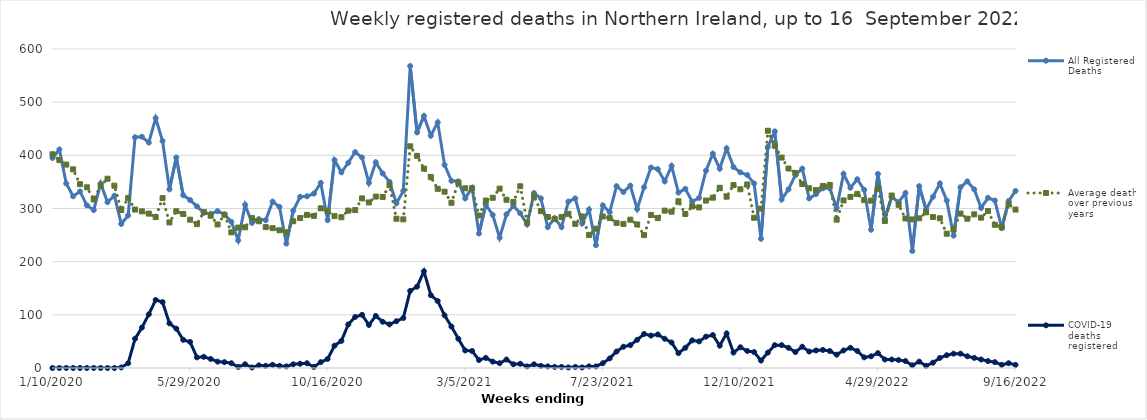
| Category | All Registered Deaths | Average deaths over previous 5 years | COVID-19 deaths registered |
|---|---|---|---|
| 1/10/20 | 395 | 402 | 0 |
| 1/17/20 | 411 | 391 | 0 |
| 1/24/20 | 347 | 382.6 | 0 |
| 1/31/20 | 323 | 373.6 | 0 |
| 2/7/20 | 332 | 345.8 | 0 |
| 2/14/20 | 306 | 339.8 | 0 |
| 2/21/20 | 297 | 317 | 0 |
| 2/28/20 | 347 | 343 | 0 |
| 3/6/20 | 312 | 356 | 0 |
| 3/13/20 | 324 | 342.8 | 0 |
| 3/20/20 | 271 | 297.2 | 1 |
| 3/27/20 | 287 | 319.6 | 9 |
| 4/3/20 | 434 | 298 | 55 |
| 4/10/20 | 435 | 294.6 | 76 |
| 4/17/20 | 424 | 290.4 | 101 |
| 4/24/20 | 470 | 283.8 | 128 |
| 5/1/20 | 427 | 319.6 | 124 |
| 5/8/20 | 336 | 273.8 | 84 |
| 5/15/20 | 396 | 294.8 | 74 |
| 5/22/20 | 325 | 289.8 | 53 |
| 5/29/20 | 316 | 279 | 49 |
| 6/5/20 | 304 | 270.6 | 20 |
| 6/12/20 | 292 | 293.2 | 21 |
| 6/19/20 | 290 | 286.4 | 17 |
| 6/26/20 | 295 | 270 | 12 |
| 7/3/20 | 289 | 288.2 | 11 |
| 7/10/20 | 275 | 255.2 | 9 |
| 7/17/20 | 240 | 264 | 2 |
| 7/24/20 | 307 | 264.6 | 7 |
| 7/31/20 | 273 | 282 | 1 |
| 8/7/20 | 280 | 276 | 5 |
| 8/14/20 | 278 | 265 | 4 |
| 8/21/20 | 313 | 263 | 6 |
| 8/28/20 | 303 | 259 | 4 |
| 9/4/20 | 234 | 255 | 3 |
| 9/11/20 | 296 | 276 | 7 |
| 9/18/20 | 322 | 282 | 8 |
| 9/25/20 | 323 | 288 | 9 |
| 10/2/20 | 328 | 286 | 2 |
| 10/9/20 | 348 | 300.4 | 11 |
| 10/16/20 | 278 | 294.8 | 17 |
| 10/23/20 | 391 | 285.6 | 42 |
| 10/30/20 | 368 | 283.6 | 51 |
| 11/6/20 | 386 | 296 | 82 |
| 11/13/20 | 406 | 297 | 96 |
| 11/20/20 | 396 | 319 | 100 |
| 11/27/20 | 348 | 311.4 | 81 |
| 12/4/20 | 387 | 322.4 | 98 |
| 12/11/20 | 366 | 321.8 | 87 |
| 12/18/20 | 350 | 343.8 | 82 |
| 12/25/20 | 310 | 280.8 | 88 |
| 1/1/21 | 333 | 279.6 | 94 |
| 1/8/21 | 568 | 417 | 145 |
| 1/15/21 | 443 | 399 | 153 |
| 1/22/21 | 474 | 375 | 182 |
| 1/29/21 | 437 | 359 | 137 |
| 2/5/21 | 462 | 337 | 126 |
| 2/12/21 | 382 | 331.6 | 99 |
| 2/19/21 | 352 | 310.8 | 78 |
| 2/26/21 | 351 | 349 | 55 |
| 3/5/21 | 319 | 338 | 33 |
| 3/12/21 | 339 | 338 | 32 |
| 3/19/21 | 253 | 286.8 | 15 |
| 3/26/21 | 307 | 315 | 19 |
| 4/2/21 | 288 | 320.2 | 12 |
| 4/9/21 | 245 | 337.4 | 9 |
| 4/16/21 | 289 | 316.4 | 16 |
| 4/23/21 | 305 | 312.4 | 7 |
| 4/30/21 | 291 | 341.8 | 8 |
| 5/7/21 | 270 | 274 | 3 |
| 5/14/21 | 329 | 323 | 7 |
| 5/21/21 | 319 | 295 | 4 |
| 5/28/21 | 265 | 284 | 3 |
| 6/4/21 | 282 | 280 | 2 |
| 6/11/21 | 265 | 284 | 2 |
| 6/18/21 | 313 | 290 | 1 |
| 6/25/21 | 319 | 271 | 2 |
| 7/2/21 | 272 | 285 | 1 |
| 7/9/21 | 298 | 250 | 3 |
| 7/16/21 | 231 | 262 | 3 |
| 7/23/21 | 306 | 285 | 9 |
| 7/30/21 | 293 | 282 | 18 |
| 8/6/21 | 342 | 273 | 31 |
| 8/13/21 | 331 | 271 | 40 |
| 8/20/21 | 343 | 279 | 43 |
| 8/27/21 | 299 | 270 | 53 |
| 9/3/21 | 340 | 250 | 64 |
| 9/10/21 | 377 | 288 | 61 |
| 9/17/21 | 374 | 282 | 63 |
| 9/24/21 | 351 | 296 | 55 |
| 10/1/21 | 380 | 294 | 48 |
| 10/8/21 | 330 | 313.6 | 28 |
| 10/15/21 | 337 | 289.6 | 38 |
| 10/22/21 | 313 | 304 | 52 |
| 10/29/21 | 320 | 302 | 50 |
| 11/5/21 | 371 | 315 | 59 |
| 11/12/21 | 403 | 320.4 | 62 |
| 11/19/21 | 375 | 339 | 42 |
| 11/26/21 | 413 | 322.2 | 65 |
| 12/3/21 | 378 | 344 | 29 |
| 12/10/21 | 368 | 336.2 | 39 |
| 12/17/21 | 363 | 345.2 | 32 |
| 12/24/21 | 347 | 282.6 | 30 |
| 12/31/21 | 243 | 299.8 | 14 |
| 1/7/22 | 416 | 446.2 | 29 |
| 1/14/22 | 445 | 418 | 43 |
| 1/21/22 | 317 | 395.8 | 43 |
| 1/28/22 | 336 | 375.2 | 38 |
| 2/4/22 | 363 | 367 | 30 |
| 2/11/22 | 375 | 346 | 40 |
| 2/18/22 | 319 | 338 | 31 |
| 2/25/22 | 327 | 334.6 | 33 |
| 3/4/22 | 338 | 342.4 | 34 |
| 3/11/22 | 338 | 344.4 | 32 |
| 3/18/22 | 301 | 279 | 25 |
| 3/25/22 | 365 | 315.2 | 33 |
| 4/1/22 | 339 | 321.8 | 38 |
| 4/8/22 | 355 | 327.4 | 32 |
| 4/15/22 | 335 | 315.8 | 20 |
| 4/22/22 | 260 | 314.8 | 22 |
| 4/29/22 | 365 | 338.8 | 28 |
| 5/6/22 | 281 | 276.4 | 16 |
| 5/13/22 | 322 | 324.4 | 16 |
| 5/20/22 | 312 | 307 | 15 |
| 5/27/22 | 329 | 281.2 | 13 |
| 6/3/22 | 220 | 279.4 | 5 |
| 6/10/22 | 342 | 281.6 | 12 |
| 6/17/22 | 298 | 292.8 | 4 |
| 6/24/22 | 322 | 284 | 10 |
| 7/1/22 | 347 | 281.6 | 19 |
| 7/8/22 | 315 | 252.6 | 24 |
| 7/15/22 | 249 | 260.4 | 27 |
| 7/22/22 | 340 | 290.4 | 27 |
| 7/29/22 | 351 | 280.8 | 22 |
| 8/5/22 | 336 | 289 | 19 |
| 8/12/22 | 301 | 282.8 | 16 |
| 8/19/22 | 320 | 295.2 | 13 |
| 8/26/22 | 315 | 269.4 | 11 |
| 9/2/22 | 263 | 265 | 6 |
| 9/9/22 | 314 | 308 | 9 |
| 9/16/22 | 333 | 298 | 6 |